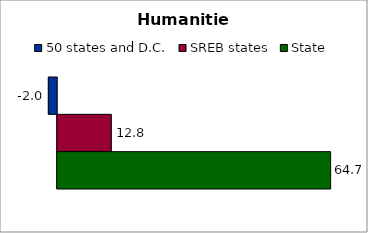
| Category | 50 states and D.C. | SREB states | State |
|---|---|---|---|
| 0 | -1.986 | 12.803 | 64.706 |